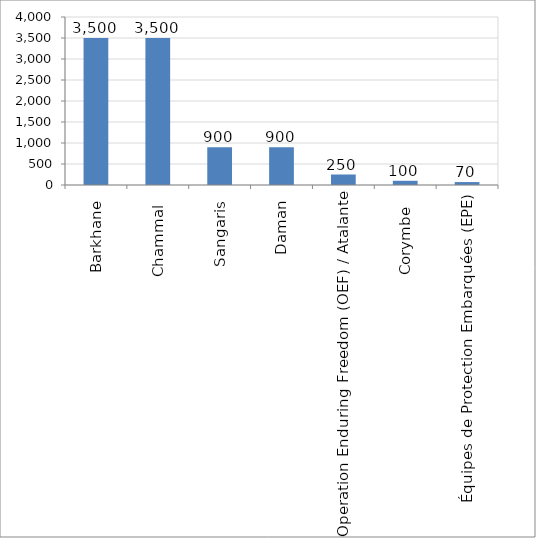
| Category | Series 0 |
|---|---|
| Barkhane | 3500 |
| Chammal  | 3500 |
| Sangaris | 900 |
| Daman | 900 |
| Operation Enduring Freedom (OEF) / Atalante | 250 |
| Corymbe  | 100 |
| Équipes de Protection Embarquées (EPE) | 70 |